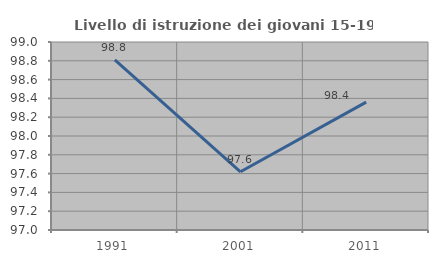
| Category | Livello di istruzione dei giovani 15-19 anni |
|---|---|
| 1991.0 | 98.81 |
| 2001.0 | 97.619 |
| 2011.0 | 98.361 |